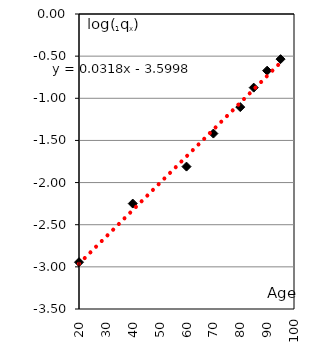
| Category | Series 0 |
|---|---|
| 20.0 | -2.945 |
| 40.0 | -2.249 |
| 60.0 | -1.811 |
| 70.0 | -1.419 |
| 80.0 | -1.105 |
| 85.0 | -0.874 |
| 90.0 | -0.672 |
| 95.0 | -0.536 |